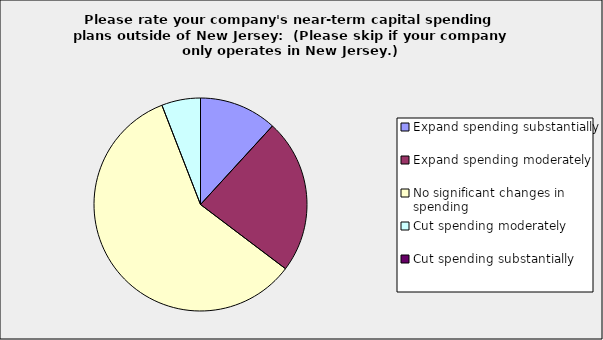
| Category | Series 0 |
|---|---|
| Expand spending substantially | 0.118 |
| Expand spending moderately | 0.235 |
| No significant changes in spending | 0.588 |
| Cut spending moderately | 0.059 |
| Cut spending substantially | 0 |